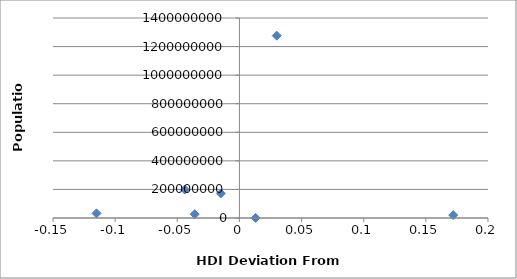
| Category | Series 0 |
|---|---|
| 0.030000000000000027 | 1276267000 |
| -0.04399999999999993 | 199085847 |
| -0.015000000000000013 | 171700000 |
| -0.11499999999999999 | 32564342 |
| -0.03599999999999992 | 26494504 |
| 0.013000000000000012 | 742737 |
| 0.17200000000000004 | 20277597 |